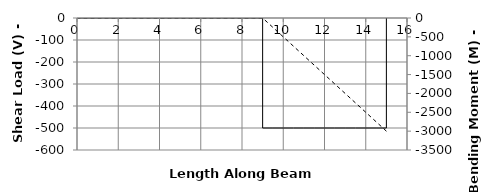
| Category | V |
|---|---|
| 0.0 | 0 |
| 0.0 | 0 |
| 0.5 | 0 |
| 1.0 | 0 |
| 1.5 | 0 |
| 2.0 | 0 |
| 2.5 | 0 |
| 3.0 | 0 |
| 3.5 | 0 |
| 4.0 | 0 |
| 4.5 | 0 |
| 5.0 | 0 |
| 5.5 | 0 |
| 6.0 | 0 |
| 6.5 | 0 |
| 7.0 | 0 |
| 7.5 | 0 |
| 8.0 | 0 |
| 8.5 | 0 |
| 9.0 | 0 |
| 9.00001 | -500 |
| 9.5 | -500 |
| 10.0 | -500 |
| 10.5 | -500 |
| 11.0 | -500 |
| 11.5 | -500 |
| 12.0 | -500 |
| 12.5 | -500 |
| 13.0 | -500 |
| 13.5 | -500 |
| 14.0 | -500 |
| 14.5 | -500 |
| 15.0 | -500 |
| 15.0 | 0 |